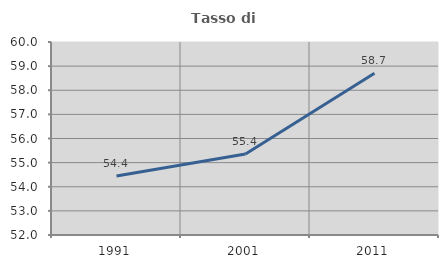
| Category | Tasso di occupazione   |
|---|---|
| 1991.0 | 54.448 |
| 2001.0 | 55.357 |
| 2011.0 | 58.705 |